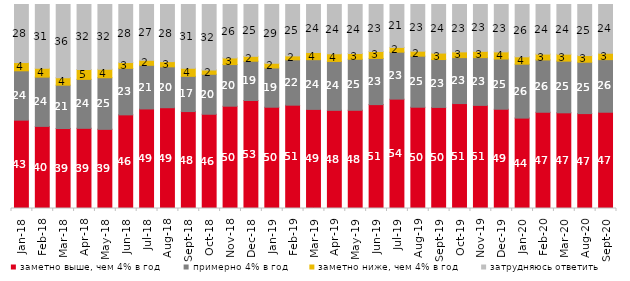
| Category | заметно выше, чем 4% в год | примерно 4% в год | заметно ниже, чем 4% в год | затрудняюсь ответить |
|---|---|---|---|---|
| 2018-01-01 | 43.3 | 24.2 | 4.05 | 28.45 |
| 2018-02-01 | 40.25 | 24.15 | 4.35 | 31.25 |
| 2018-03-01 | 39.2 | 21.25 | 3.7 | 35.85 |
| 2018-04-01 | 39.3 | 24 | 4.85 | 31.85 |
| 2018-05-01 | 38.8 | 25.3 | 4.15 | 31.75 |
| 2018-06-01 | 45.9 | 22.8 | 2.85 | 28.45 |
| 2018-07-01 | 48.8 | 21.4 | 2.45 | 27.35 |
| 2018-08-01 | 49.4 | 20.05 | 2.55 | 28 |
| 2018-09-01 | 47.5 | 17.25 | 4 | 31.2 |
| 2018-10-01 | 46.2 | 19.6 | 2.15 | 32.05 |
| 2018-11-01 | 50.15 | 20.409 | 3.244 | 26.198 |
| 2018-12-01 | 52.95 | 19.25 | 2.4 | 25.4 |
| 2019-01-01 | 49.65 | 19.25 | 2.3 | 28.8 |
| 2019-02-01 | 50.65 | 22.25 | 1.9 | 25.2 |
| 2019-03-01 | 48.583 | 24.366 | 3.531 | 23.521 |
| 2019-04-01 | 48.119 | 23.96 | 3.762 | 24.158 |
| 2019-05-01 | 48.143 | 25.012 | 2.823 | 24.022 |
| 2019-06-01 | 50.923 | 22.643 | 3.392 | 23.042 |
| 2019-07-01 | 53.614 | 23.02 | 2.327 | 21.04 |
| 2019-08-01 | 49.65 | 25.025 | 2.448 | 22.877 |
| 2019-09-01 | 49.554 | 23.465 | 3.168 | 23.812 |
| 2019-10-01 | 51.436 | 22.525 | 2.822 | 23.218 |
| 2019-11-01 | 50.545 | 23.416 | 3.069 | 22.97 |
| 2019-12-01 | 48.663 | 24.604 | 3.515 | 23.218 |
| 2020-01-01 | 44.307 | 26.436 | 3.614 | 25.644 |
| 2020-02-01 | 47.178 | 25.644 | 2.871 | 24.307 |
| 2020-03-01 | 46.901 | 25.335 | 3.421 | 24.343 |
| 2020-08-01 | 46.524 | 25.174 | 3.277 | 25.025 |
| 2020-09-01 | 47.188 | 25.784 | 3.136 | 23.892 |